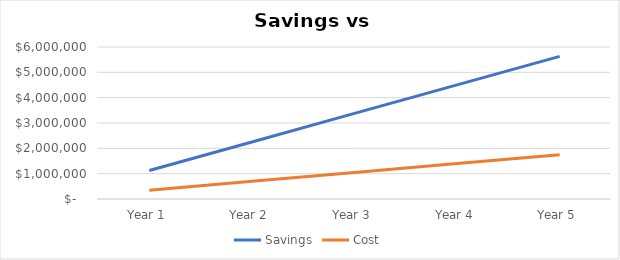
| Category | Savings | Cost |
|---|---|---|
| Year 1 | 1126250 | 350000 |
| Year 2 | 2252500 | 700000 |
| Year 3 | 3378750 | 1050000 |
| Year 4 | 4505000 | 1400000 |
| Year 5 | 5631250 | 1750000 |